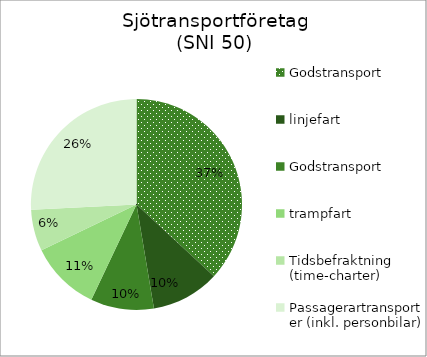
| Category | Godstransport, linjefart Godstransport, trampfart Tidsbefraktning (time-charter) Passagerartransporter (inkl. personbilar) Personaluthyrning för drift och bemanning av andras fartyg Övrigt |
|---|---|
| 0 | 13490.32 |
| 1 | 3828.503 |
| 2 | 3542.138 |
| 3 | 3951.986 |
| 4 | 2328.268 |
| 5 | 9429.769 |